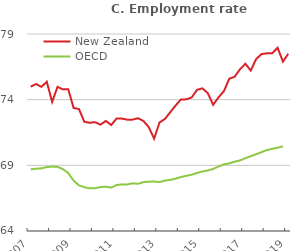
| Category | New Zealand |
|---|---|
| 2007 | 74.99 |
| 2007Q2 | 75.189 |
| 2007Q3 | 74.979 |
| 2007Q4 | 75.362 |
| 2008 | 73.827 |
| 2008Q2 | 74.975 |
| 2008Q3 | 74.784 |
| 2008Q4 | 74.794 |
| 2009 | 73.367 |
| 2009Q2 | 73.283 |
| 2009Q3 | 72.314 |
| 2009Q4 | 72.24 |
| 2010 | 72.285 |
| 2010Q2 | 72.098 |
| 2010Q3 | 72.383 |
| 2010Q4 | 72.071 |
| 2011 | 72.565 |
| 2011Q2 | 72.559 |
| 2011Q3 | 72.478 |
| 2011Q4 | 72.48 |
| 2012 | 72.589 |
| 2012Q2 | 72.375 |
| 2012Q3 | 71.908 |
| 2012Q4 | 71.031 |
| 2013 | 72.263 |
| 2013Q2 | 72.527 |
| 2013Q3 | 73.04 |
| 2013Q4 | 73.557 |
| 2014 | 74.02 |
| 2014Q2 | 74.023 |
| 2014Q3 | 74.169 |
| 2014Q4 | 74.75 |
| 2015 | 74.863 |
| 2015Q2 | 74.492 |
| 2015Q3 | 73.606 |
| 2015Q4 | 74.181 |
| 2016 | 74.648 |
| 2016Q2 | 75.594 |
| 2016Q3 | 75.744 |
| 2016Q4 | 76.314 |
| 2017 | 76.733 |
| 2017Q2 | 76.22 |
| 2017Q3 | 77.088 |
| 2017Q4 | 77.464 |
| 2018 | 77.53 |
| 2018Q2 | 77.536 |
| 2018Q3 | 77.951 |
| 2018Q4 | 76.899 |
| 2019 | 77.502 |